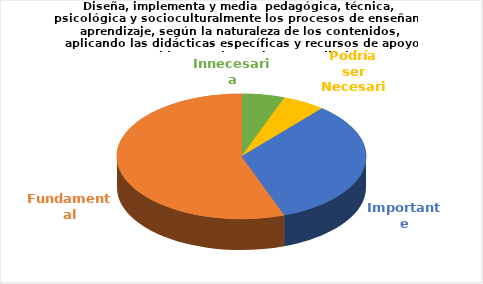
| Category | Series 0 |
|---|---|
| Innecesaria | 1 |
| Podría ser Necesaria | 1 |
| Importante | 6 |
| Fundamental | 10 |